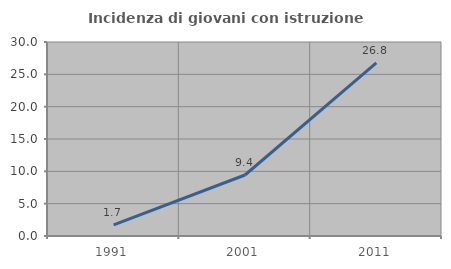
| Category | Incidenza di giovani con istruzione universitaria |
|---|---|
| 1991.0 | 1.724 |
| 2001.0 | 9.434 |
| 2011.0 | 26.786 |